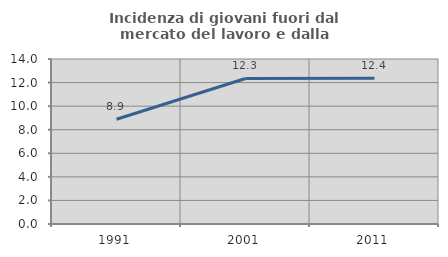
| Category | Incidenza di giovani fuori dal mercato del lavoro e dalla formazione  |
|---|---|
| 1991.0 | 8.889 |
| 2001.0 | 12.346 |
| 2011.0 | 12.371 |